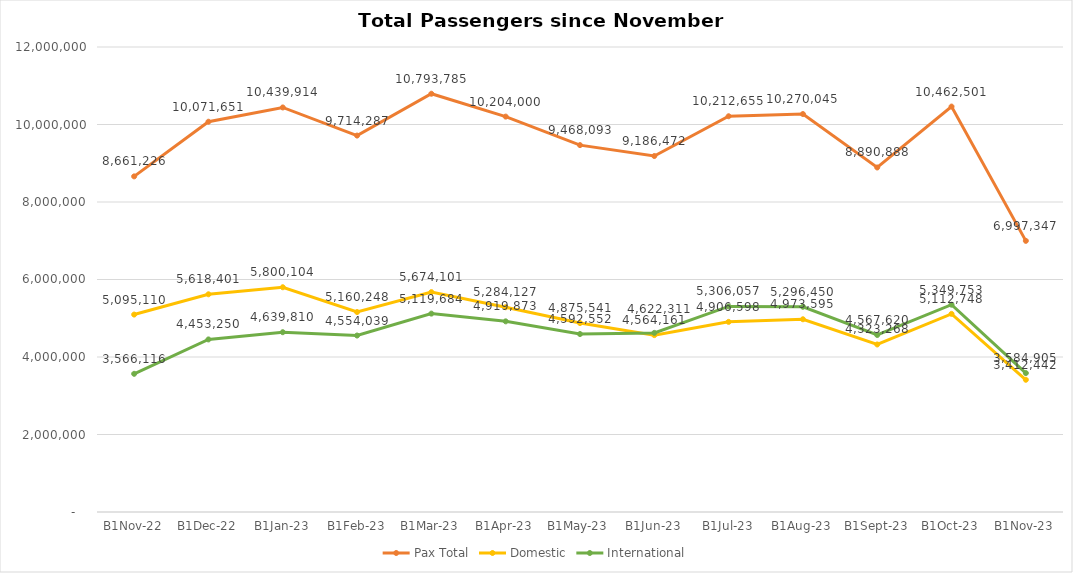
| Category | Pax Total | Domestic | International |
|---|---|---|---|
| 2022-11-01 | 8661226 | 5095110 | 3566116 |
| 2022-12-01 | 10071651 | 5618401 | 4453250 |
| 2023-01-01 | 10439914 | 5800104 | 4639810 |
| 2023-02-01 | 9714287 | 5160248 | 4554039 |
| 2023-03-01 | 10793785 | 5674101 | 5119684 |
| 2023-04-01 | 10204000 | 5284127 | 4919873 |
| 2023-05-01 | 9468093 | 4875541 | 4592552 |
| 2023-06-01 | 9186472 | 4564161 | 4622311 |
| 2023-07-01 | 10212655 | 4906598 | 5306057 |
| 2023-08-01 | 10270045 | 4973595 | 5296450 |
| 2023-09-01 | 8890888 | 4323268 | 4567620 |
| 2023-10-01 | 10462501 | 5112748 | 5349753 |
| 2023-11-01 | 6997347 | 3412442 | 3584905 |